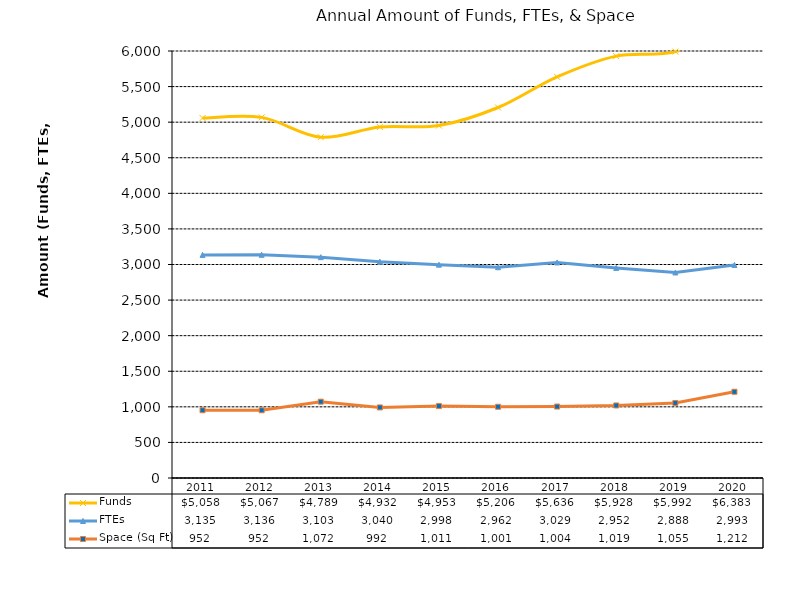
| Category | Funds | FTEs | Space (Sq Ft) |
|---|---|---|---|
| 2011.0 | 5058.105 | 3135 | 951.998 |
| 2012.0 | 5067.342 | 3136 | 951.592 |
| 2013.0 | 4789.014 | 3103 | 1072.41 |
| 2014.0 | 4932.368 | 3040 | 991.644 |
| 2015.0 | 4952.593 | 2998 | 1010.876 |
| 2016.0 | 5206.174 | 2962 | 1000.815 |
| 2017.0 | 5636.393 | 3029 | 1003.896 |
| 2018.0 | 5928 | 2952 | 1019.284 |
| 2019.0 | 5992 | 2888 | 1054.501 |
| 2020.0 | 6383 | 2993 | 1211.944 |